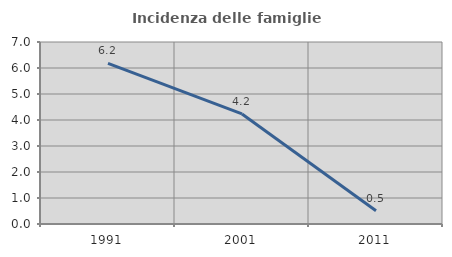
| Category | Incidenza delle famiglie numerose |
|---|---|
| 1991.0 | 6.18 |
| 2001.0 | 4.233 |
| 2011.0 | 0.51 |